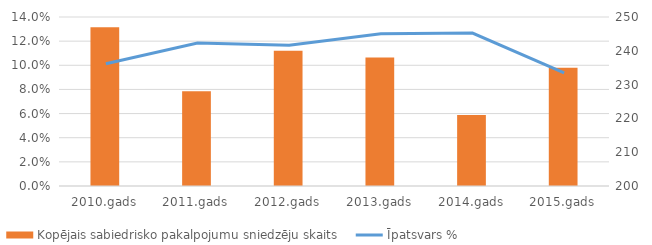
| Category | Kopējais sabiedrisko pakalpojumu sniedzēju skaits |
|---|---|
| 2010.gads | 247 |
| 2011.gads | 228 |
| 2012.gads | 240 |
| 2013.gads | 238 |
| 2014.gads | 221 |
| 2015.gads | 235 |